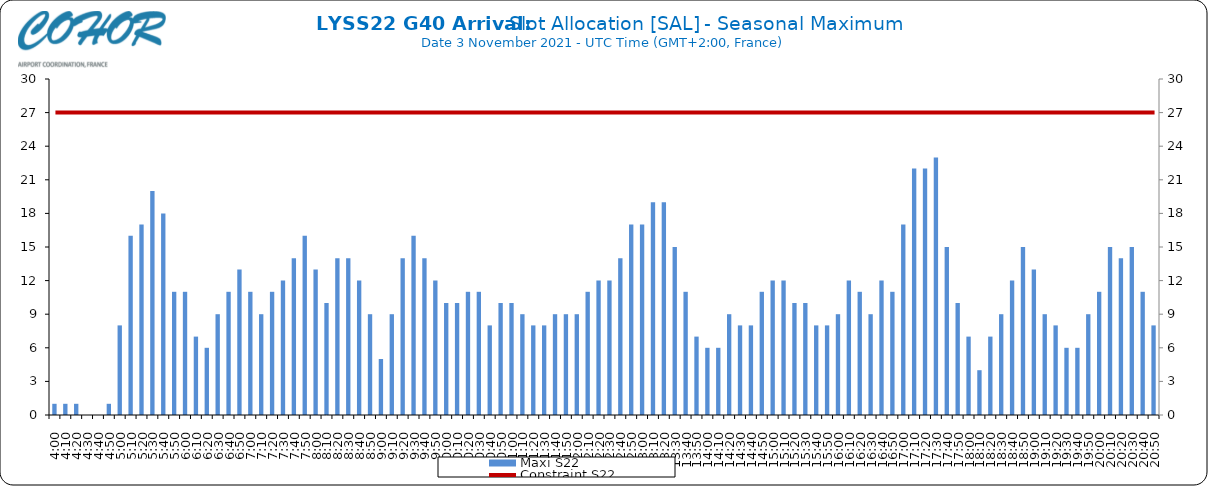
| Category | Maxi S22 |
|---|---|
| 0.16666666666666666 | 1 |
| 0.17361111111111113 | 1 |
| 0.18055555555555555 | 1 |
| 0.1875 | 0 |
| 0.19444444444444445 | 0 |
| 0.20138888888888887 | 1 |
| 0.20833333333333334 | 8 |
| 0.2152777777777778 | 16 |
| 0.2222222222222222 | 17 |
| 0.22916666666666666 | 20 |
| 0.23611111111111113 | 18 |
| 0.24305555555555555 | 11 |
| 0.25 | 11 |
| 0.2569444444444445 | 7 |
| 0.2638888888888889 | 6 |
| 0.2708333333333333 | 9 |
| 0.2777777777777778 | 11 |
| 0.2847222222222222 | 13 |
| 0.2916666666666667 | 11 |
| 0.2986111111111111 | 9 |
| 0.3055555555555555 | 11 |
| 0.3125 | 12 |
| 0.3194444444444445 | 14 |
| 0.3263888888888889 | 16 |
| 0.3333333333333333 | 13 |
| 0.34027777777777773 | 10 |
| 0.34722222222222227 | 14 |
| 0.3541666666666667 | 14 |
| 0.3611111111111111 | 12 |
| 0.3680555555555556 | 9 |
| 0.375 | 5 |
| 0.3819444444444444 | 9 |
| 0.3888888888888889 | 14 |
| 0.3958333333333333 | 16 |
| 0.40277777777777773 | 14 |
| 0.40972222222222227 | 12 |
| 0.4166666666666667 | 10 |
| 0.4236111111111111 | 10 |
| 0.4305555555555556 | 11 |
| 0.4375 | 11 |
| 0.4444444444444444 | 8 |
| 0.4513888888888889 | 10 |
| 0.4583333333333333 | 10 |
| 0.46527777777777773 | 9 |
| 0.47222222222222227 | 8 |
| 0.4791666666666667 | 8 |
| 0.4861111111111111 | 9 |
| 0.4930555555555556 | 9 |
| 0.5 | 9 |
| 0.5069444444444444 | 11 |
| 0.513888888888889 | 12 |
| 0.5208333333333334 | 12 |
| 0.5277777777777778 | 14 |
| 0.5347222222222222 | 17 |
| 0.5416666666666666 | 17 |
| 0.548611111111111 | 19 |
| 0.5555555555555556 | 19 |
| 0.5625 | 15 |
| 0.5694444444444444 | 11 |
| 0.576388888888889 | 7 |
| 0.5833333333333334 | 6 |
| 0.5902777777777778 | 6 |
| 0.5972222222222222 | 9 |
| 0.6041666666666666 | 8 |
| 0.611111111111111 | 8 |
| 0.6180555555555556 | 11 |
| 0.625 | 12 |
| 0.6319444444444444 | 12 |
| 0.638888888888889 | 10 |
| 0.6458333333333334 | 10 |
| 0.6527777777777778 | 8 |
| 0.6597222222222222 | 8 |
| 0.6666666666666666 | 9 |
| 0.6736111111111112 | 12 |
| 0.6805555555555555 | 11 |
| 0.6875 | 9 |
| 0.6944444444444445 | 12 |
| 0.7013888888888888 | 11 |
| 0.7083333333333334 | 17 |
| 0.7152777777777778 | 22 |
| 0.7222222222222222 | 22 |
| 0.7291666666666666 | 23 |
| 0.7361111111111112 | 15 |
| 0.7430555555555555 | 10 |
| 0.75 | 7 |
| 0.7569444444444445 | 4 |
| 0.7638888888888888 | 7 |
| 0.7708333333333334 | 9 |
| 0.7777777777777778 | 12 |
| 0.7847222222222222 | 15 |
| 0.7916666666666666 | 13 |
| 0.7986111111111112 | 9 |
| 0.8055555555555555 | 8 |
| 0.8125 | 6 |
| 0.8194444444444445 | 6 |
| 0.8263888888888888 | 9 |
| 0.8333333333333334 | 11 |
| 0.8402777777777778 | 15 |
| 0.8472222222222222 | 14 |
| 0.8541666666666666 | 15 |
| 0.8611111111111112 | 11 |
| 0.8680555555555555 | 8 |